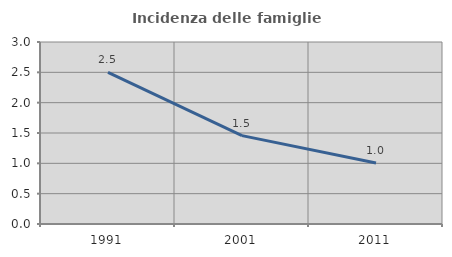
| Category | Incidenza delle famiglie numerose |
|---|---|
| 1991.0 | 2.5 |
| 2001.0 | 1.457 |
| 2011.0 | 1.007 |